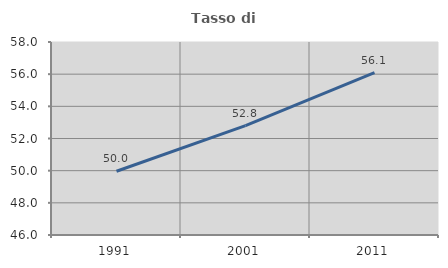
| Category | Tasso di occupazione   |
|---|---|
| 1991.0 | 49.964 |
| 2001.0 | 52.799 |
| 2011.0 | 56.091 |